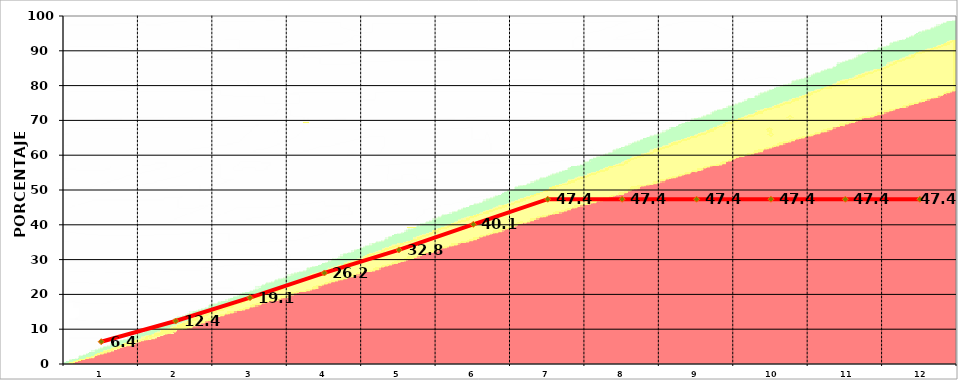
| Category | Series 0 |
|---|---|
| 0 | 6.406 |
| 1 | 12.355 |
| 2 | 19.06 |
| 3 | 26.156 |
| 4 | 32.78 |
| 5 | 40.13 |
| 6 | 47.351 |
| 7 | 47.351 |
| 8 | 47.351 |
| 9 | 47.351 |
| 10 | 47.351 |
| 11 | 47.351 |